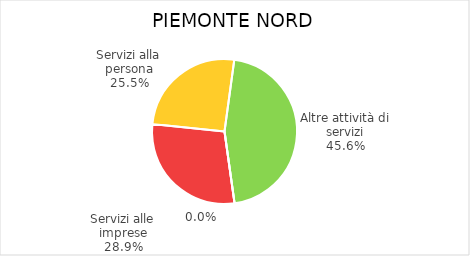
| Category | Piemonte Nord |
|---|---|
| Servizi alle imprese | 6930 |
| Servizi alla persona | 6129 |
| Altre attività di servizi | 10954 |